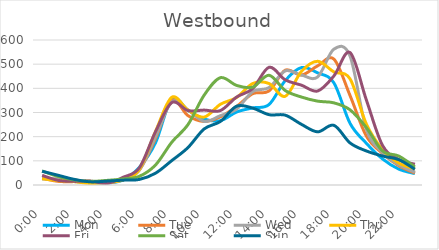
| Category | Mon | Tue | Wed | Thu | Fri | Sat | Sun |
|---|---|---|---|---|---|---|---|
| 0.0 | 28 | 28 | 25 | 26 | 40 | 58 | 57 |
| 0.041667 | 20 | 15 | 25 | 18 | 19 | 35 | 40 |
| 0.083333 | 15 | 14 | 14 | 14 | 15 | 21 | 23 |
| 0.125 | 9 | 15 | 12 | 6 | 16 | 15 | 13 |
| 0.166667 | 8 | 8 | 9 | 11 | 7 | 19 | 16 |
| 0.208333 | 21 | 24 | 22 | 21 | 32 | 25 | 20 |
| 0.25 | 73 | 63 | 61 | 64 | 71 | 36 | 23 |
| 0.291667 | 175 | 193 | 200 | 222 | 221 | 83 | 49 |
| 0.333333 | 356 | 350 | 344 | 363 | 341 | 177 | 101 |
| 0.375 | 309 | 287 | 311 | 310 | 308 | 250 | 155 |
| 0.416667 | 273 | 263 | 263 | 281 | 310 | 372 | 232 |
| 0.458333 | 266 | 282 | 287 | 334 | 308 | 444 | 263 |
| 0.5 | 302 | 325 | 314 | 362 | 364 | 412 | 326 |
| 0.541667 | 319 | 378 | 387 | 420 | 399 | 405 | 318 |
| 0.5833333333333334 | 333 | 389 | 403 | 420 | 487 | 454 | 291 |
| 0.625 | 432 | 475 | 472 | 367 | 435 | 391 | 289 |
| 0.666667 | 486 | 455 | 455 | 470 | 413 | 364 | 251 |
| 0.708333 | 464 | 493 | 447 | 512 | 389 | 347 | 220 |
| 0.75 | 423 | 521 | 562 | 468 | 451 | 340 | 247 |
| 0.791667 | 255 | 370 | 533 | 439 | 548 | 311 | 174 |
| 0.833333 | 173 | 203 | 231 | 253 | 353 | 238 | 141 |
| 0.875 | 108 | 131 | 135 | 147 | 164 | 141 | 120 |
| 0.916667 | 66 | 80 | 84 | 91 | 106 | 120 | 105 |
| 0.958333 | 47 | 49 | 53 | 67 | 86 | 75 | 65 |